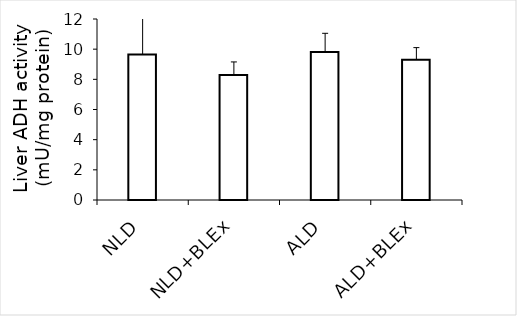
| Category | Series 0 |
|---|---|
| NLD | 9.646 |
| NLD+BLEx | 8.28 |
| ALD | 9.811 |
| ALD+BLEx | 9.292 |